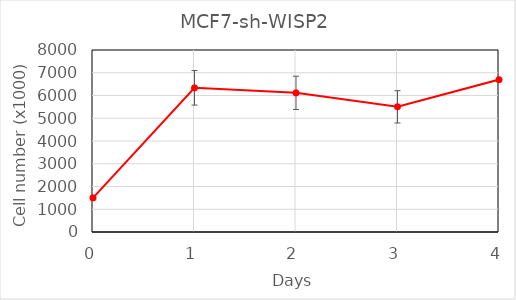
| Category | Series 0 |
|---|---|
| 0.0 | 1500 |
| 1.0 | 6337.5 |
| 2.0 | 6117 |
| 3.0 | 5501.5 |
| 4.0 | 6697.5 |